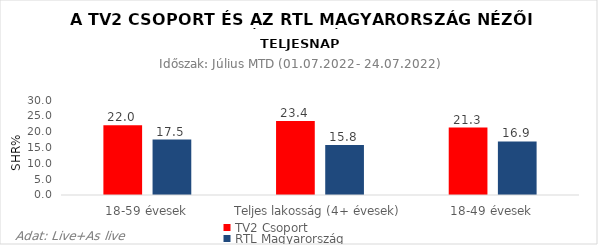
| Category | TV2 Csoport | RTL Magyarország |
|---|---|---|
| 18-59 évesek | 22 | 17.5 |
| Teljes lakosság (4+ évesek) | 23.4 | 15.8 |
| 18-49 évesek | 21.3 | 16.9 |